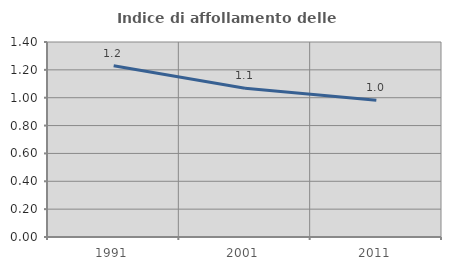
| Category | Indice di affollamento delle abitazioni  |
|---|---|
| 1991.0 | 1.23 |
| 2001.0 | 1.068 |
| 2011.0 | 0.982 |